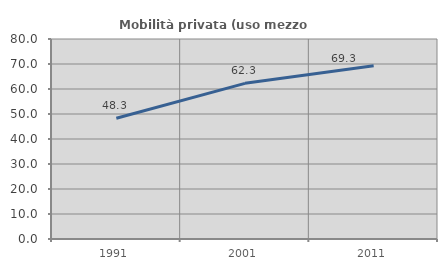
| Category | Mobilità privata (uso mezzo privato) |
|---|---|
| 1991.0 | 48.289 |
| 2001.0 | 62.267 |
| 2011.0 | 69.256 |